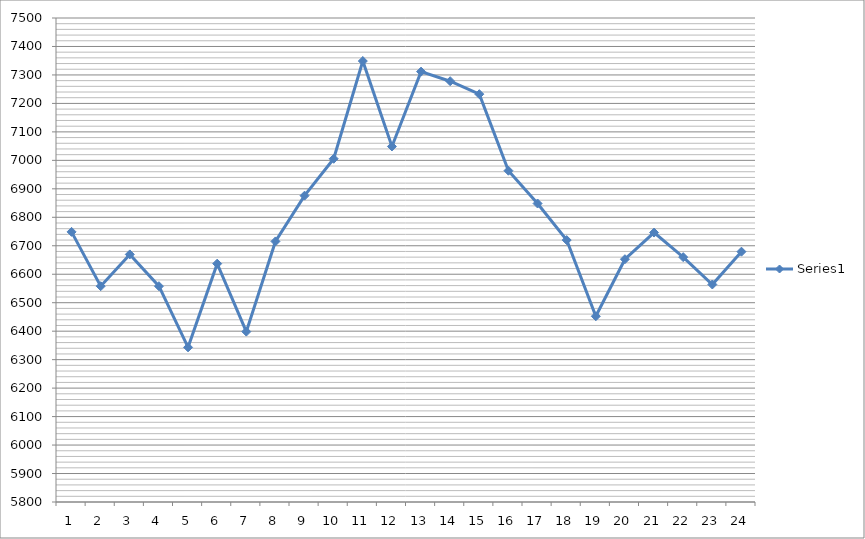
| Category | Series 0 |
|---|---|
| 0 | 6748.8 |
| 1 | 6558 |
| 2 | 6669.6 |
| 3 | 6558 |
| 4 | 6343.2 |
| 5 | 6637.2 |
| 6 | 6398.4 |
| 7 | 6715.2 |
| 8 | 6876 |
| 9 | 7005.6 |
| 10 | 7348.8 |
| 11 | 7048.8 |
| 12 | 7311.6 |
| 13 | 7278 |
| 14 | 7232.4 |
| 15 | 6963.6 |
| 16 | 6848.4 |
| 17 | 6720 |
| 18 | 6452.4 |
| 19 | 6652.8 |
| 20 | 6746.4 |
| 21 | 6660 |
| 22 | 6564 |
| 23 | 6679.2 |